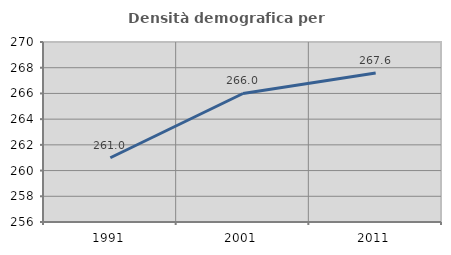
| Category | Densità demografica |
|---|---|
| 1991.0 | 260.999 |
| 2001.0 | 265.996 |
| 2011.0 | 267.588 |